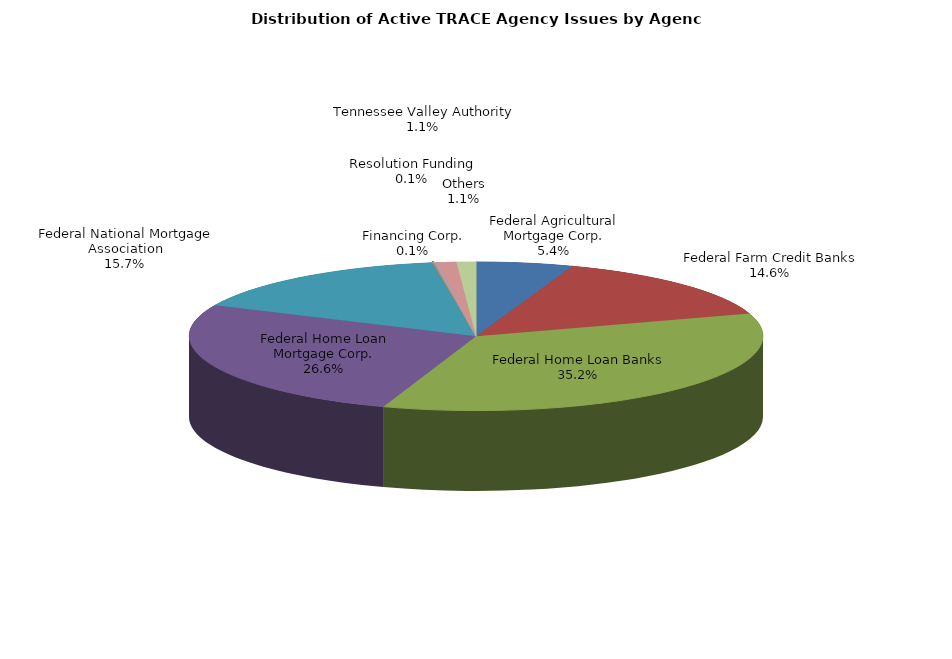
| Category | Series 0 |
|---|---|
| Federal Agricultural Mortgage Corp. | 2368 |
| Federal Farm Credit Banks | 6341 |
| Federal Home Loan Banks | 15305 |
| Federal Home Loan Mortgage Corp. | 11581 |
| Federal National Mortgage Association | 6840 |
| Financing Corp. | 45 |
| Resolution Funding | 59 |
| Tennessee Valley Authority | 477 |
| Others | 473 |